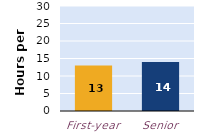
| Category | hours per week |
|---|---|
| First-year | 13 |
| Senior | 14 |